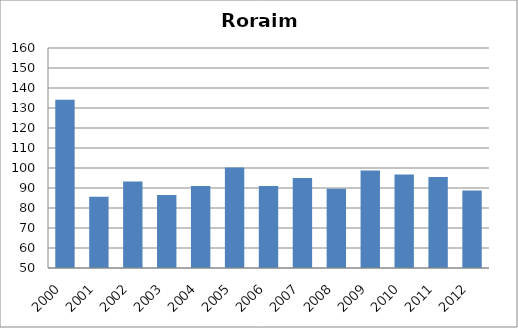
| Category | Poliomielite |
|---|---|
| 2000.0 | 134.1 |
| 2001.0 | 85.58 |
| 2002.0 | 93.31 |
| 2003.0 | 86.46 |
| 2004.0 | 91.02 |
| 2005.0 | 100.22 |
| 2006.0 | 90.94 |
| 2007.0 | 95 |
| 2008.0 | 89.57 |
| 2009.0 | 98.71 |
| 2010.0 | 96.71 |
| 2011.0 | 95.52 |
| 2012.0 | 88.78 |